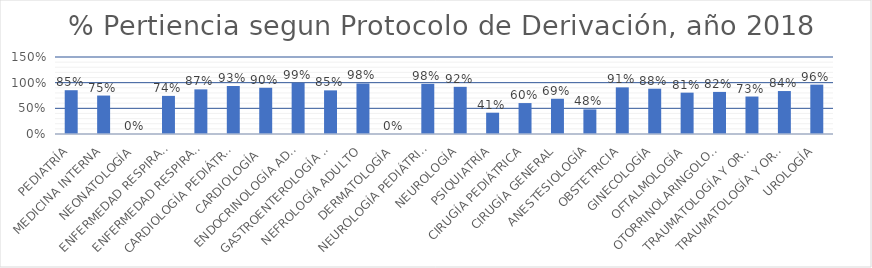
| Category | Series 0 |
|---|---|
| PEDIATRÍA | 0.853 |
| MEDICINA INTERNA | 0.749 |
| NEONATOLOGÍA | 0 |
| ENFERMEDAD RESPIRATORIA PEDIÁTRICA (BRONCOPULMONAR INFANTIL) | 0.743 |
| ENFERMEDAD RESPIRATORIA DE ADULTO (BRONCOPULMONAR) | 0.87 |
| CARDIOLOGÍA PEDIÁTRICA | 0.935 |
| CARDIOLOGÍA  | 0.9 |
| ENDOCRINOLOGÍA ADULTO | 0.994 |
| GASTROENTEROLOGÍA ADULTO | 0.85 |
| NEFROLOGÍA ADULTO | 0.985 |
| DERMATOLOGÍA | 0 |
| NEUROLOGÍA PEDIÁTRICA | 0.978 |
| NEUROLOGÍA | 0.919 |
| PSIQUIATRÍA | 0.415 |
| CIRUGÍA PEDIÁTRICA | 0.603 |
| CIRUGÍA GENERAL | 0.687 |
| ANESTESIOLOGÍA | 0.479 |
| OBSTETRICIA | 0.908 |
| GINECOLOGÍA | 0.882 |
| OFTALMOLOGÍA | 0.805 |
| OTORRINOLARINGOLOGÍA | 0.82 |
| TRAUMATOLOGÍA Y ORTOPEDIA PEDIÁTRICA | 0.73 |
| TRAUMATOLOGÍA Y ORTOPEDIA | 0.837 |
| UROLOGÍA | 0.962 |